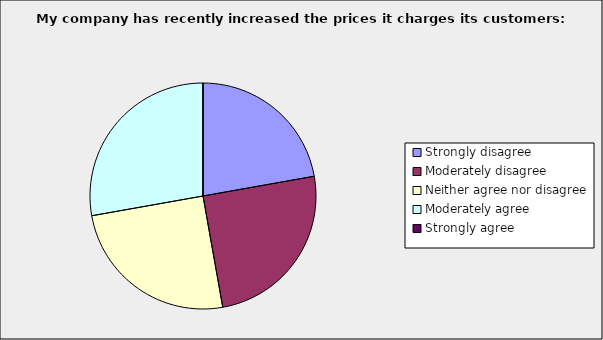
| Category | Series 0 |
|---|---|
| Strongly disagree | 0.222 |
| Moderately disagree | 0.25 |
| Neither agree nor disagree | 0.25 |
| Moderately agree | 0.278 |
| Strongly agree | 0 |